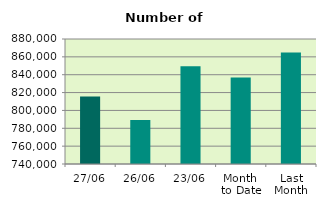
| Category | Series 0 |
|---|---|
| 27/06 | 815668 |
| 26/06 | 789284 |
| 23/06 | 849434 |
| Month 
to Date | 836830.526 |
| Last
Month | 864947.091 |